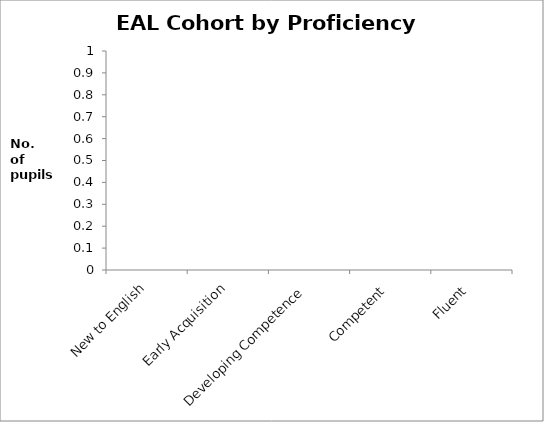
| Category | Series 0 |
|---|---|
| New to English | 0 |
| Early Acquisition | 0 |
| Developing Competence | 0 |
| Competent | 0 |
| Fluent | 0 |